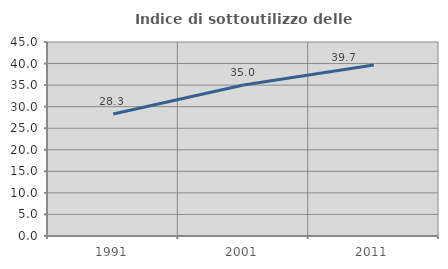
| Category | Indice di sottoutilizzo delle abitazioni  |
|---|---|
| 1991.0 | 28.285 |
| 2001.0 | 35.039 |
| 2011.0 | 39.69 |